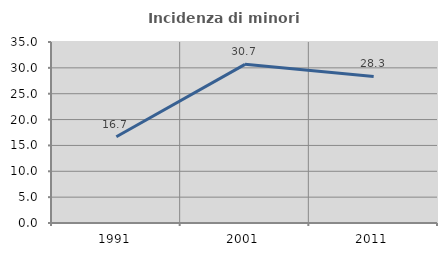
| Category | Incidenza di minori stranieri |
|---|---|
| 1991.0 | 16.667 |
| 2001.0 | 30.682 |
| 2011.0 | 28.343 |